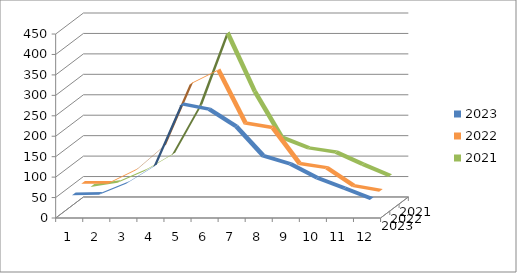
| Category | 2023 | 2022 | 2021 |
|---|---|---|---|
| 0 | 47 | 58 | 33 |
| 1 | 48 | 58 | 43 |
| 2 | 75 | 90 | 72 |
| 3 | 116 | 147 | 111 |
| 4 | 267 | 300 | 229 |
| 5 | 254 | 333 | 406 |
| 6 | 212 | 203 | 263 |
| 7 | 140 | 192 | 151 |
| 8 | 120 | 104 | 125 |
| 9 | 86 | 94 | 115 |
| 10 | 61 | 50 | 85 |
| 11 | 35 | 38 | 57 |